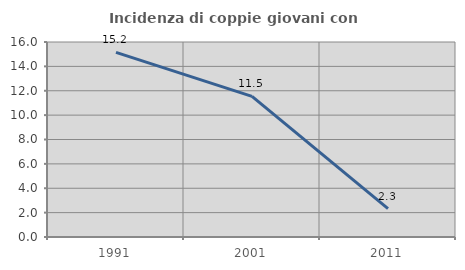
| Category | Incidenza di coppie giovani con figli |
|---|---|
| 1991.0 | 15.152 |
| 2001.0 | 11.538 |
| 2011.0 | 2.326 |